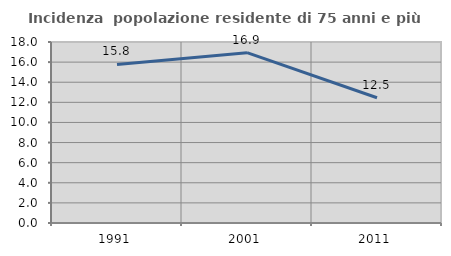
| Category | Incidenza  popolazione residente di 75 anni e più |
|---|---|
| 1991.0 | 15.773 |
| 2001.0 | 16.938 |
| 2011.0 | 12.452 |